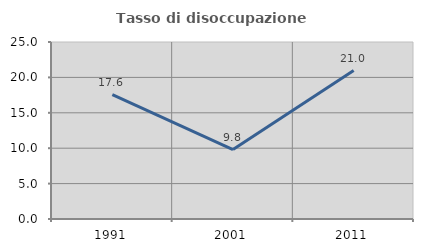
| Category | Tasso di disoccupazione giovanile  |
|---|---|
| 1991.0 | 17.573 |
| 2001.0 | 9.804 |
| 2011.0 | 20.968 |